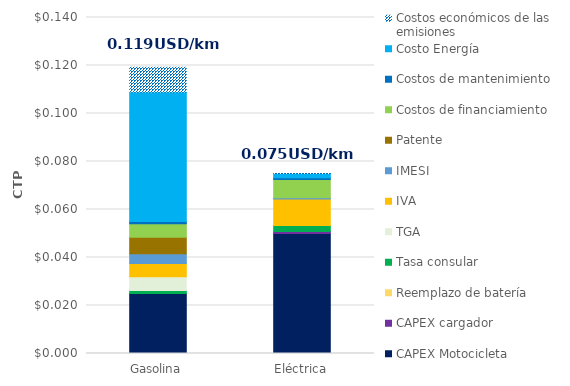
| Category | CAPEX Motocicleta | CAPEX cargador | Reemplazo de batería | Tasa consular | TGA | IVA | IMESI | Patente | Costos de financiamiento | Costos de mantenimiento | Costo Energía | Costos económicos de las emisiones |
|---|---|---|---|---|---|---|---|---|---|---|---|---|
| Gasolina | 0.025 | 0 | 0 | 0.001 | 0.006 | 0.006 | 0.004 | 0.007 | 0.006 | 0.001 | 0.054 | 0.01 |
| Eléctrica | 0.05 | 0.001 | 0 | 0.002 | 0 | 0.011 | 0.001 | 0 | 0.008 | 0.001 | 0.002 | 0 |